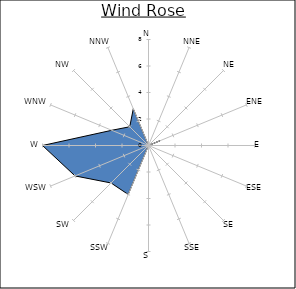
| Category | Series 0 |
|---|---|
| N | 0 |
| NNE | 0 |
| NE | 0 |
| ENE | 1 |
| E | 0 |
| ESE | 0 |
| SE | 0 |
| SSE | 0 |
| S | 0 |
| SSW | 4 |
| SW | 4 |
| WSW | 6 |
| W | 8 |
| WNW | 3 |
| NW | 2 |
| NNW | 3 |